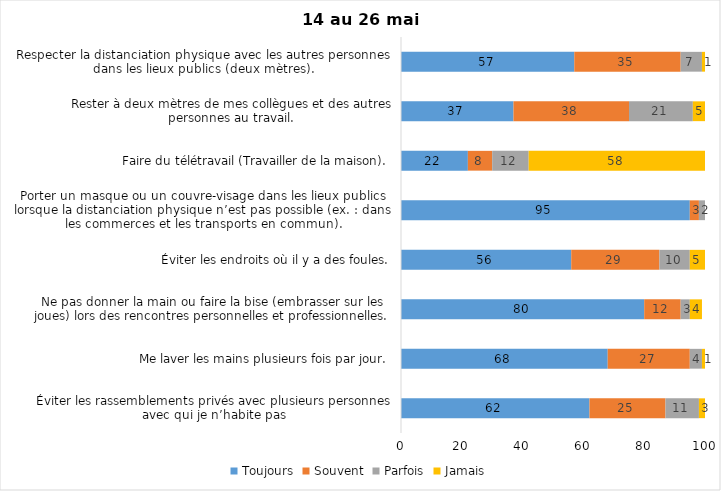
| Category | Toujours | Souvent | Parfois | Jamais |
|---|---|---|---|---|
| Éviter les rassemblements privés avec plusieurs personnes avec qui je n’habite pas | 62 | 25 | 11 | 3 |
| Me laver les mains plusieurs fois par jour. | 68 | 27 | 4 | 1 |
| Ne pas donner la main ou faire la bise (embrasser sur les joues) lors des rencontres personnelles et professionnelles. | 80 | 12 | 3 | 4 |
| Éviter les endroits où il y a des foules. | 56 | 29 | 10 | 5 |
| Porter un masque ou un couvre-visage dans les lieux publics lorsque la distanciation physique n’est pas possible (ex. : dans les commerces et les transports en commun). | 95 | 3 | 2 | 0 |
| Faire du télétravail (Travailler de la maison). | 22 | 8 | 12 | 58 |
| Rester à deux mètres de mes collègues et des autres personnes au travail. | 37 | 38 | 21 | 5 |
| Respecter la distanciation physique avec les autres personnes dans les lieux publics (deux mètres). | 57 | 35 | 7 | 1 |